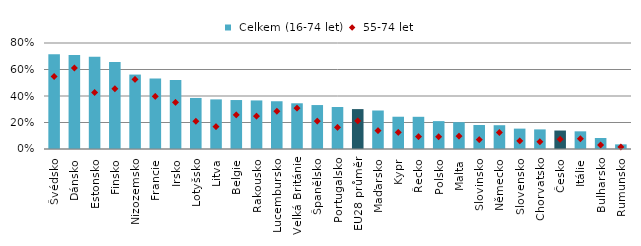
| Category |  Celkem (16-74 let) |
|---|---|
| Švédsko | 0.715 |
| Dánsko | 0.709 |
| Estonsko | 0.697 |
| Finsko | 0.657 |
| Nizozemsko | 0.562 |
| Francie | 0.532 |
| Irsko | 0.522 |
| Lotyšsko | 0.385 |
| Litva | 0.374 |
| Belgie | 0.37 |
| Rakousko | 0.367 |
| Lucembursko | 0.36 |
| Velká Británie | 0.345 |
| Španělsko | 0.332 |
| Portugalsko | 0.317 |
| EU28 průměr | 0.301 |
| Maďarsko | 0.291 |
| Kypr | 0.244 |
| Řecko | 0.243 |
| Polsko | 0.21 |
| Malta | 0.202 |
| Slovinsko | 0.181 |
| Německo | 0.18 |
| Slovensko | 0.154 |
| Chorvatsko | 0.148 |
| Česko | 0.139 |
| Itálie | 0.133 |
| Bulharsko | 0.083 |
| Rumunsko | 0.035 |